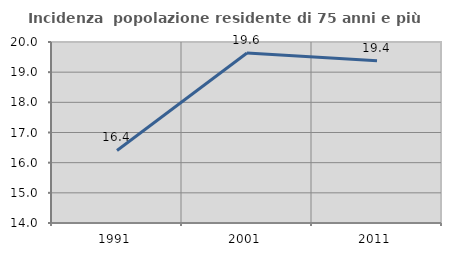
| Category | Incidenza  popolazione residente di 75 anni e più |
|---|---|
| 1991.0 | 16.404 |
| 2001.0 | 19.636 |
| 2011.0 | 19.375 |